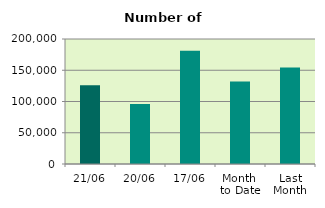
| Category | Series 0 |
|---|---|
| 21/06 | 125974 |
| 20/06 | 95830 |
| 17/06 | 181330 |
| Month 
to Date | 132156 |
| Last
Month | 154240.182 |